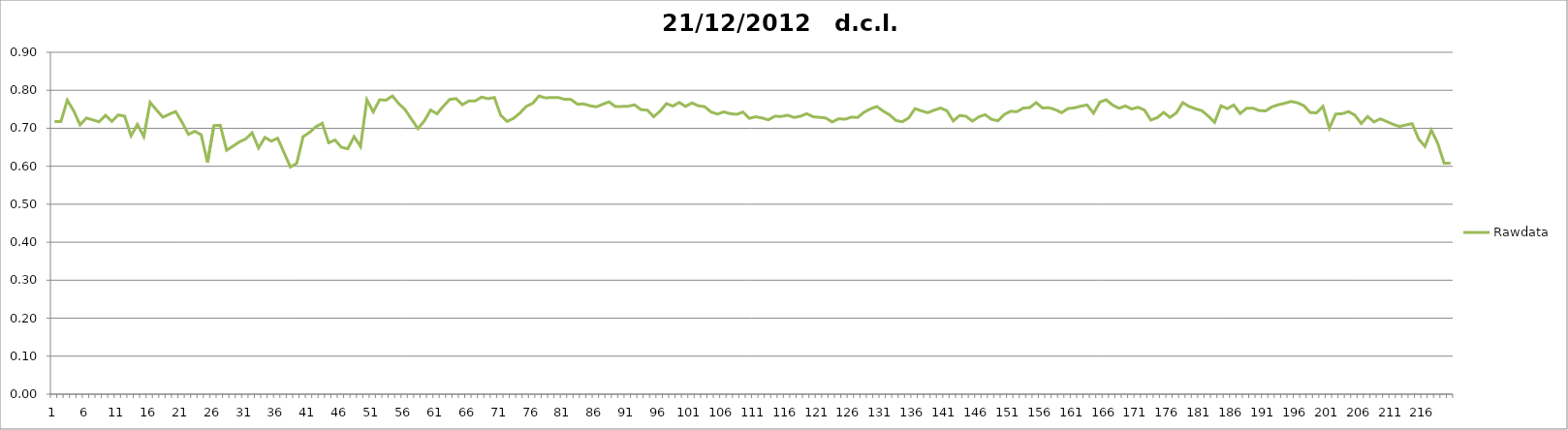
| Category | Rawdata |
|---|---|
| 0 | 0.718 |
| 1 | 0.718 |
| 2 | 0.774 |
| 3 | 0.746 |
| 4 | 0.709 |
| 5 | 0.727 |
| 6 | 0.722 |
| 7 | 0.717 |
| 8 | 0.734 |
| 9 | 0.718 |
| 10 | 0.735 |
| 11 | 0.732 |
| 12 | 0.68 |
| 13 | 0.71 |
| 14 | 0.678 |
| 15 | 0.768 |
| 16 | 0.748 |
| 17 | 0.729 |
| 18 | 0.737 |
| 19 | 0.744 |
| 20 | 0.716 |
| 21 | 0.684 |
| 22 | 0.692 |
| 23 | 0.683 |
| 24 | 0.61 |
| 25 | 0.707 |
| 26 | 0.708 |
| 27 | 0.642 |
| 28 | 0.653 |
| 29 | 0.664 |
| 30 | 0.672 |
| 31 | 0.688 |
| 32 | 0.648 |
| 33 | 0.676 |
| 34 | 0.666 |
| 35 | 0.674 |
| 36 | 0.636 |
| 37 | 0.598 |
| 38 | 0.608 |
| 39 | 0.678 |
| 40 | 0.689 |
| 41 | 0.704 |
| 42 | 0.713 |
| 43 | 0.662 |
| 44 | 0.669 |
| 45 | 0.65 |
| 46 | 0.646 |
| 47 | 0.678 |
| 48 | 0.652 |
| 49 | 0.775 |
| 50 | 0.743 |
| 51 | 0.775 |
| 52 | 0.774 |
| 53 | 0.785 |
| 54 | 0.765 |
| 55 | 0.749 |
| 56 | 0.724 |
| 57 | 0.699 |
| 58 | 0.719 |
| 59 | 0.748 |
| 60 | 0.738 |
| 61 | 0.758 |
| 62 | 0.776 |
| 63 | 0.778 |
| 64 | 0.762 |
| 65 | 0.772 |
| 66 | 0.772 |
| 67 | 0.782 |
| 68 | 0.778 |
| 69 | 0.781 |
| 70 | 0.734 |
| 71 | 0.718 |
| 72 | 0.726 |
| 73 | 0.74 |
| 74 | 0.758 |
| 75 | 0.766 |
| 76 | 0.785 |
| 77 | 0.78 |
| 78 | 0.781 |
| 79 | 0.781 |
| 80 | 0.776 |
| 81 | 0.776 |
| 82 | 0.764 |
| 83 | 0.764 |
| 84 | 0.759 |
| 85 | 0.757 |
| 86 | 0.763 |
| 87 | 0.77 |
| 88 | 0.757 |
| 89 | 0.758 |
| 90 | 0.758 |
| 91 | 0.762 |
| 92 | 0.749 |
| 93 | 0.748 |
| 94 | 0.731 |
| 95 | 0.745 |
| 96 | 0.765 |
| 97 | 0.758 |
| 98 | 0.768 |
| 99 | 0.758 |
| 100 | 0.767 |
| 101 | 0.759 |
| 102 | 0.757 |
| 103 | 0.743 |
| 104 | 0.737 |
| 105 | 0.743 |
| 106 | 0.739 |
| 107 | 0.737 |
| 108 | 0.742 |
| 109 | 0.726 |
| 110 | 0.73 |
| 111 | 0.727 |
| 112 | 0.722 |
| 113 | 0.732 |
| 114 | 0.731 |
| 115 | 0.734 |
| 116 | 0.728 |
| 117 | 0.732 |
| 118 | 0.739 |
| 119 | 0.73 |
| 120 | 0.729 |
| 121 | 0.727 |
| 122 | 0.717 |
| 123 | 0.725 |
| 124 | 0.724 |
| 125 | 0.729 |
| 126 | 0.728 |
| 127 | 0.742 |
| 128 | 0.751 |
| 129 | 0.757 |
| 130 | 0.745 |
| 131 | 0.736 |
| 132 | 0.72 |
| 133 | 0.717 |
| 134 | 0.727 |
| 135 | 0.752 |
| 136 | 0.746 |
| 137 | 0.741 |
| 138 | 0.748 |
| 139 | 0.753 |
| 140 | 0.746 |
| 141 | 0.719 |
| 142 | 0.734 |
| 143 | 0.732 |
| 144 | 0.719 |
| 145 | 0.73 |
| 146 | 0.736 |
| 147 | 0.724 |
| 148 | 0.72 |
| 149 | 0.736 |
| 150 | 0.745 |
| 151 | 0.744 |
| 152 | 0.753 |
| 153 | 0.755 |
| 154 | 0.768 |
| 155 | 0.753 |
| 156 | 0.754 |
| 157 | 0.749 |
| 158 | 0.741 |
| 159 | 0.752 |
| 160 | 0.754 |
| 161 | 0.758 |
| 162 | 0.761 |
| 163 | 0.74 |
| 164 | 0.769 |
| 165 | 0.775 |
| 166 | 0.761 |
| 167 | 0.753 |
| 168 | 0.759 |
| 169 | 0.751 |
| 170 | 0.755 |
| 171 | 0.748 |
| 172 | 0.722 |
| 173 | 0.728 |
| 174 | 0.742 |
| 175 | 0.729 |
| 176 | 0.741 |
| 177 | 0.768 |
| 178 | 0.758 |
| 179 | 0.751 |
| 180 | 0.746 |
| 181 | 0.732 |
| 182 | 0.716 |
| 183 | 0.759 |
| 184 | 0.752 |
| 185 | 0.761 |
| 186 | 0.739 |
| 187 | 0.753 |
| 188 | 0.753 |
| 189 | 0.747 |
| 190 | 0.746 |
| 191 | 0.756 |
| 192 | 0.762 |
| 193 | 0.766 |
| 194 | 0.771 |
| 195 | 0.767 |
| 196 | 0.76 |
| 197 | 0.741 |
| 198 | 0.741 |
| 199 | 0.758 |
| 200 | 0.7 |
| 201 | 0.738 |
| 202 | 0.738 |
| 203 | 0.744 |
| 204 | 0.735 |
| 205 | 0.713 |
| 206 | 0.731 |
| 207 | 0.717 |
| 208 | 0.725 |
| 209 | 0.718 |
| 210 | 0.711 |
| 211 | 0.705 |
| 212 | 0.709 |
| 213 | 0.712 |
| 214 | 0.672 |
| 215 | 0.652 |
| 216 | 0.695 |
| 217 | 0.661 |
| 218 | 0.608 |
| 219 | 0.608 |